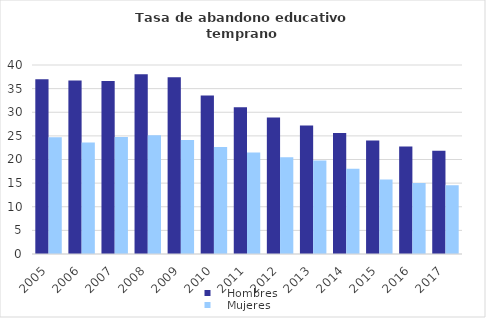
| Category |    Hombres |    Mujeres |
|---|---|---|
| 2005.0 | 36.959 | 24.7 |
| 2006.0 | 36.708 | 23.607 |
| 2007.0 | 36.631 | 24.737 |
| 2008.0 | 38.05 | 25.147 |
| 2009.0 | 37.398 | 24.114 |
| 2010.0 | 33.554 | 22.632 |
| 2011.0 | 31.035 | 21.468 |
| 2012.0 | 28.876 | 20.455 |
| 2013.0 | 27.176 | 19.791 |
| 2014.0 | 25.598 | 18.057 |
| 2015.0 | 24.035 | 15.788 |
| 2016.0 | 22.743 | 15.051 |
| 2017.0 | 21.846 | 14.537 |